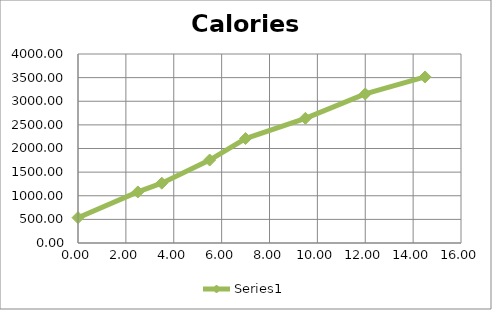
| Category | Series 0 |
|---|---|
| 0.0 | 535.634 |
| 2.5 | 1080.674 |
| 3.5 | 1265.674 |
| 5.5 | 1755.674 |
| 7.0 | 2210.714 |
| 9.5 | 2638.874 |
| 12.0 | 3154.394 |
| 14.5 | 3514.394 |